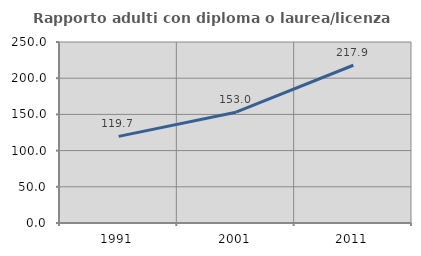
| Category | Rapporto adulti con diploma o laurea/licenza media  |
|---|---|
| 1991.0 | 119.672 |
| 2001.0 | 153.012 |
| 2011.0 | 217.895 |